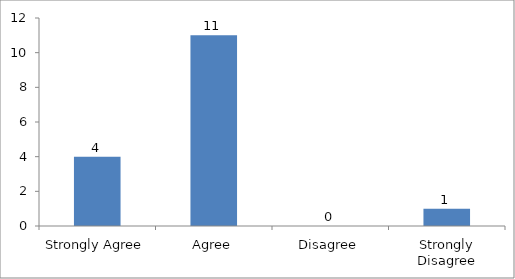
| Category | Would you recommend the youth social entrepreneurship program to other technical institutions? |
|---|---|
| Strongly Agree | 4 |
| Agree | 11 |
| Disagree | 0 |
| Strongly Disagree | 1 |